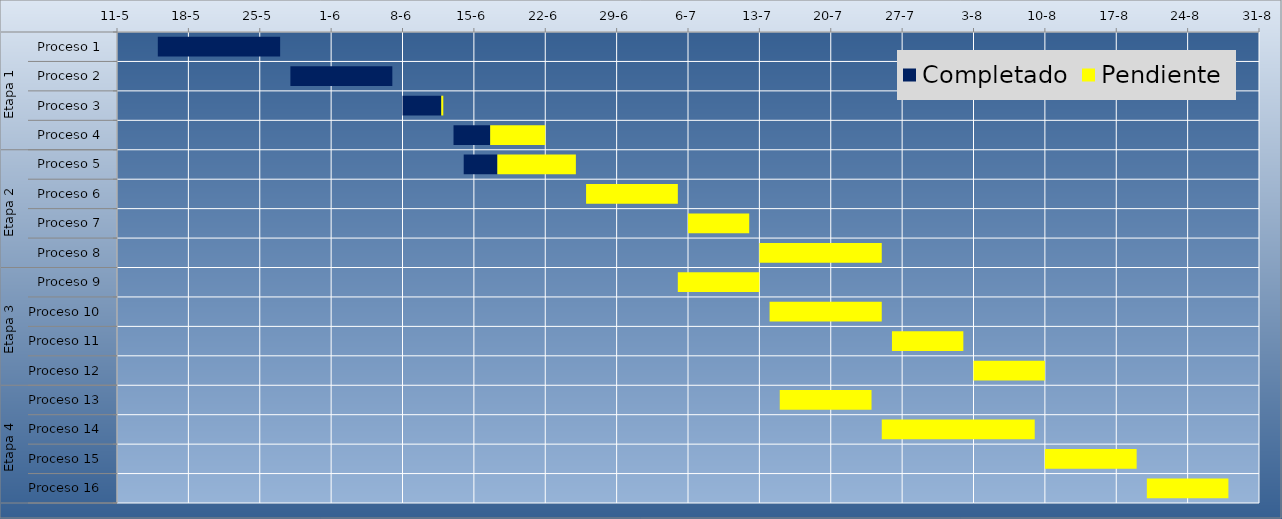
| Category | Fecha Inicio | Completado | Pendiente |
|---|---|---|---|
| 0 | 5/15/15 | 12 | 0 |
| 1 | 5/28/15 | 10 | 0 |
| 2 | 6/8/15 | 3.8 | 0.2 |
| 3 | 6/13/15 | 3.6 | 5.4 |
| 4 | 6/14/15 | 3.3 | 7.7 |
| 5 | 6/26/15 | 0 | 9 |
| 6 | 7/6/15 | 0 | 6 |
| 7 | 7/13/15 | 0 | 12 |
| 8 | 7/5/15 | 0 | 8 |
| 9 | 7/14/15 | 0 | 11 |
| 10 | 7/26/15 | 0 | 7 |
| 11 | 8/3/15 | 0 | 7 |
| 12 | 7/15/15 | 0 | 9 |
| 13 | 7/25/15 | 0 | 15 |
| 14 | 8/10/15 | 0 | 9 |
| 15 | 8/20/15 | 0 | 8 |